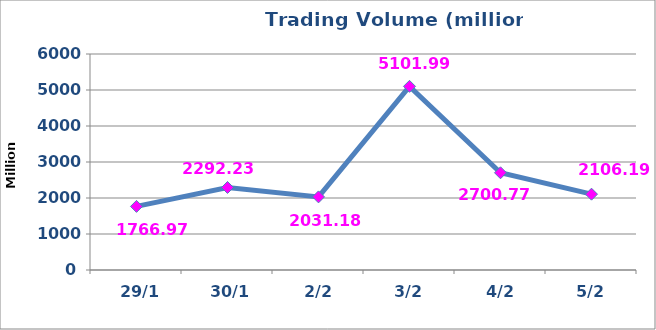
| Category | القيمة المتداولة |
|---|---|
|  29/1 | 1766969705 |
|  30/1 | 2292235290 |
|  2/2 | 2031186130 |
|  3/2 | 5101996408 |
|  4/2 | 2700771891 |
|  5/2 | 2106194610 |